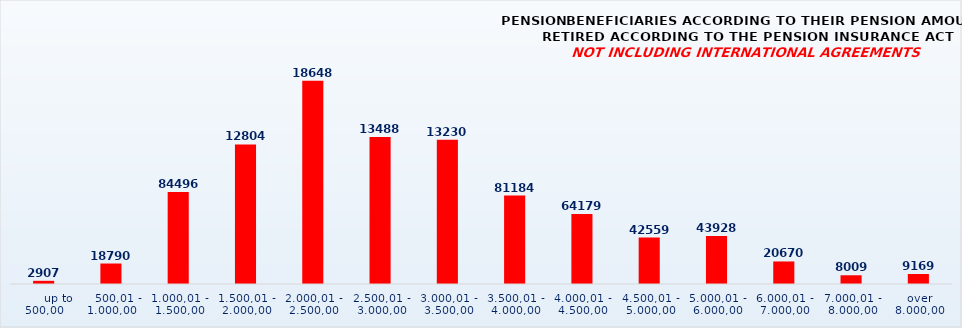
| Category | PENSION BENEFICIARIES ACCORDING TO TYPES AND AMOUNTS OF PENSION, RETIRED ACCORDING TO THE PENSION INSURANCE ACT
NOT INCLUDING INTERNATIONAL AGREEMENTS |
|---|---|
|       up to 500,00 | 2907 |
|    500,01 - 1.000,00 | 18790 |
| 1.000,01 - 1.500,00 | 84496 |
| 1.500,01 - 2.000,00 | 128043 |
| 2.000,01 - 2.500,00 | 186488 |
| 2.500,01 - 3.000,00 | 134881 |
| 3.000,01 - 3.500,00 | 132309 |
| 3.500,01 - 4.000,00 | 81184 |
| 4.000,01 - 4.500,00 | 64179 |
| 4.500,01 - 5.000,00 | 42559 |
| 5.000,01 - 6.000,00 | 43928 |
| 6.000,01 - 7.000,00 | 20670 |
| 7.000,01 - 8.000,00 | 8009 |
|  over  8.000,00 | 9169 |